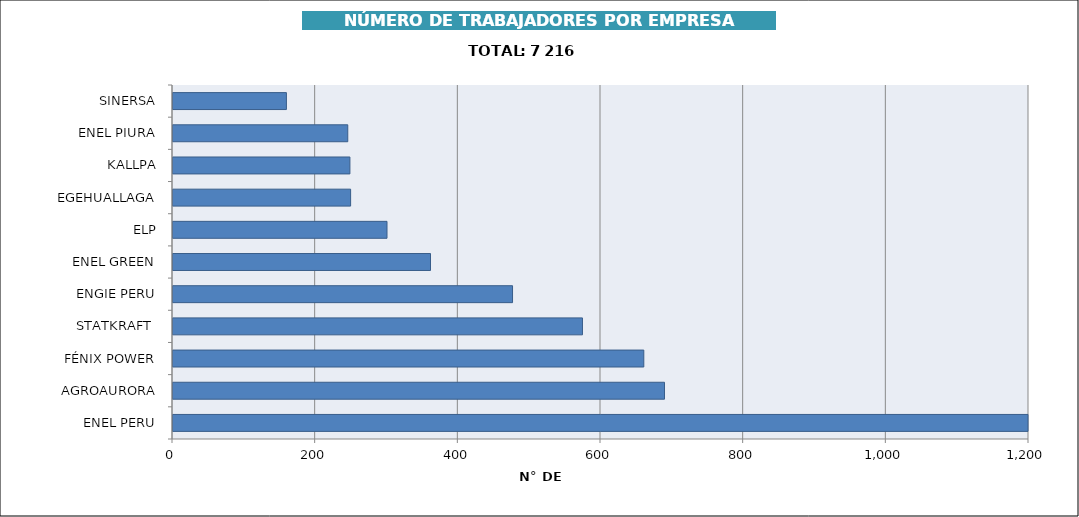
| Category | Series 0 |
|---|---|
| ENEL PERU | 1364 |
| AGROAURORA | 689 |
| FÉNIX POWER | 660 |
| STATKRAFT  | 574 |
| ENGIE PERU | 476 |
| ENEL GREEN | 361 |
| ELP | 300 |
| EGEHUALLAGA | 249 |
| KALLPA | 248 |
| ENEL PIURA | 245 |
| SINERSA | 159 |